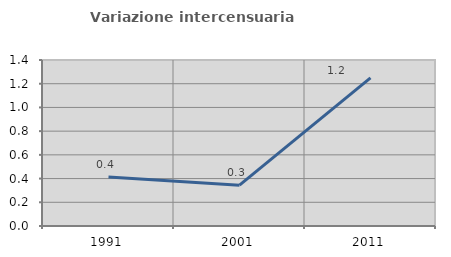
| Category | Variazione intercensuaria annua |
|---|---|
| 1991.0 | 0.413 |
| 2001.0 | 0.344 |
| 2011.0 | 1.249 |